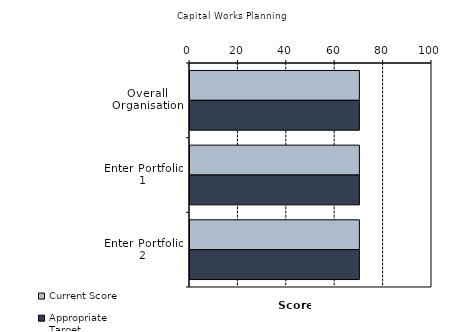
| Category | Current Score | Appropriate Target |
|---|---|---|
| Overall Organisation | 70 | 70 |
| Enter Portfolio 1 | 70 | 70 |
| Enter Portfolio 2 | 70 | 70 |